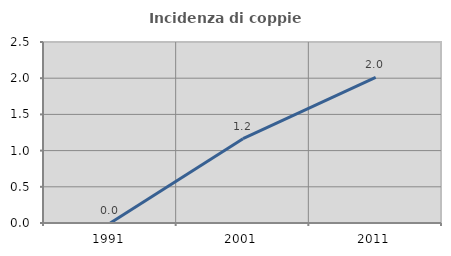
| Category | Incidenza di coppie miste |
|---|---|
| 1991.0 | 0 |
| 2001.0 | 1.165 |
| 2011.0 | 2.012 |